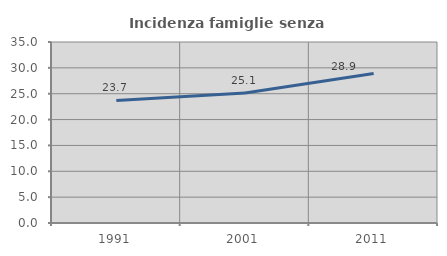
| Category | Incidenza famiglie senza nuclei |
|---|---|
| 1991.0 | 23.705 |
| 2001.0 | 25.127 |
| 2011.0 | 28.909 |